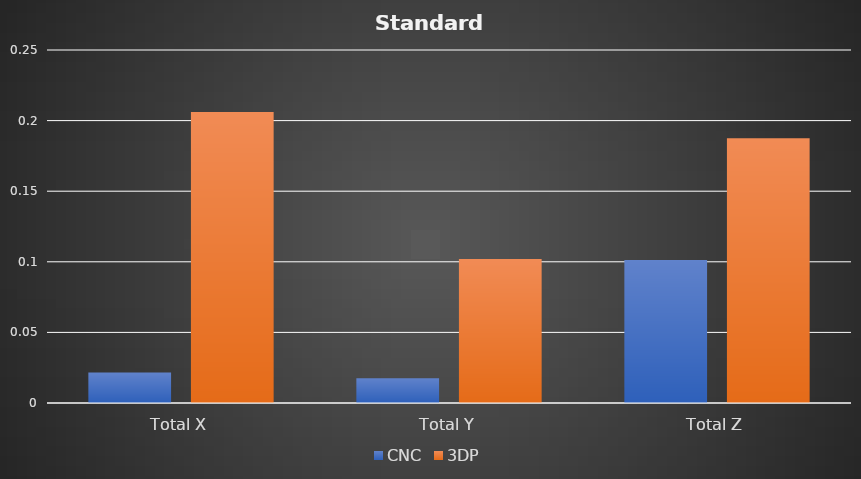
| Category | CNC | 3DP |
|---|---|---|
| Total X | 0.022 | 0.206 |
| Total Y | 0.018 | 0.102 |
| Total Z | 0.101 | 0.187 |